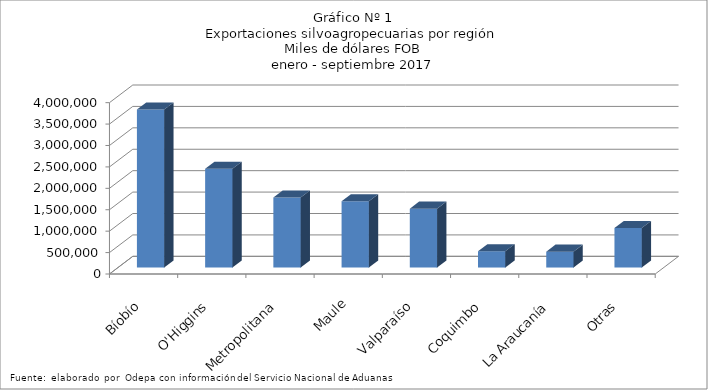
| Category | Series 0 |
|---|---|
| Bíobío | 3688183.942 |
| O'Higgins | 2303257.086 |
| Metropolitana | 1632638.108 |
| Maule | 1545976.497 |
| Valparaíso | 1374473.822 |
| Coquimbo | 381207.733 |
| La Araucanía | 370016.451 |
| Otras | 921110.542 |